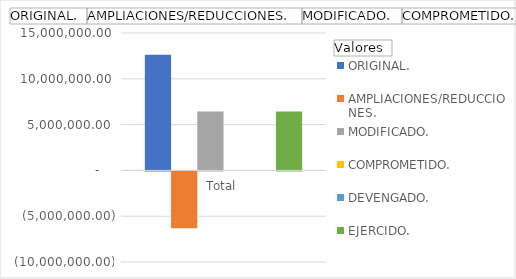
| Category | ORIGINAL. | AMPLIACIONES/REDUCCIONES. | MODIFICADO. | COMPROMETIDO. | DEVENGADO. | EJERCIDO. |
|---|---|---|---|---|---|---|
| Total | 12625591 | -6199074.14 | 6426516.86 | 0 | 0 | 6426516.86 |